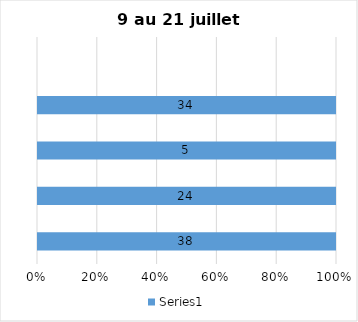
| Category | Series 0 |
|---|---|
| Septembre 2021 | 38 |
| À la fin de l’année 2021 | 24 |
| Jamais | 5 |
| Au cours de l’année 2022 | 34 |
| Au cours de l’année 2023 | 0 |